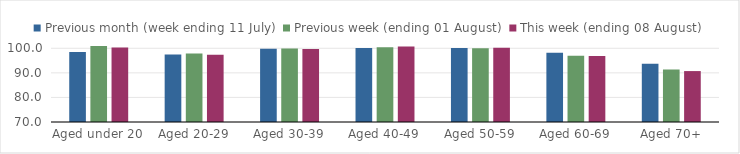
| Category | Previous month (week ending 11 July) | Previous week (ending 01 August) | This week (ending 08 August) |
|---|---|---|---|
| Aged under 20 | 98.492 | 100.894 | 100.302 |
| Aged 20-29 | 97.436 | 97.908 | 97.326 |
| Aged 30-39 | 99.767 | 99.902 | 99.697 |
| Aged 40-49 | 100.088 | 100.423 | 100.696 |
| Aged 50-59 | 100.134 | 99.966 | 100.218 |
| Aged 60-69 | 98.15 | 96.976 | 96.833 |
| Aged 70+ | 93.749 | 91.347 | 90.725 |